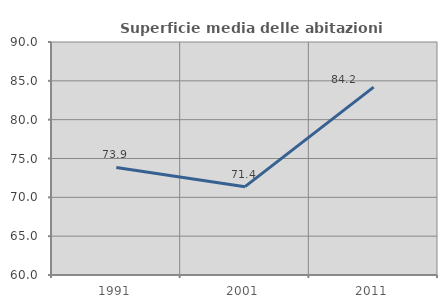
| Category | Superficie media delle abitazioni occupate |
|---|---|
| 1991.0 | 73.855 |
| 2001.0 | 71.372 |
| 2011.0 | 84.191 |